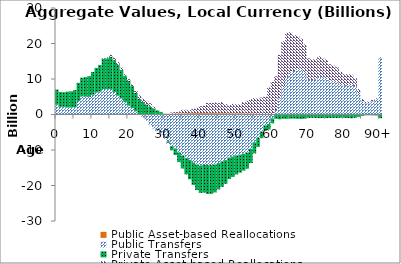
| Category | Public Asset-based Reallocations | Public Transfers | Private Transfers | Private Asset-based Reallocations |
|---|---|---|---|---|
| 0 | 8.092 | 2748.724 | 4289.608 | -169.187 |
|  | 7.989 | 2171.902 | 4144.176 | -93.478 |
| 2 | 8.125 | 2148.795 | 4119.979 | -91.648 |
| 3 | 9.049 | 1967.311 | 4468.515 | 24.611 |
| 4 | 9.156 | 1962.499 | 4567.77 | -22.379 |
| 5 | 9.583 | 2047.002 | 4802.95 | -38.806 |
| 6 | 10.312 | 3815.309 | 5081.429 | 47.349 |
| 7 | 10.588 | 5087.075 | 5277.298 | -14.346 |
| 8 | 10.856 | 5050.846 | 5466.852 | -68.893 |
| 9 | 11.866 | 4976.634 | 5820.726 | 90.197 |
| 10 | 12.942 | 5554.61 | 6396.919 | 51.38 |
| 11 | 13.899 | 6196.399 | 6925.226 | -1.856 |
| 12 | 15.134 | 6424.49 | 7494.681 | 32.801 |
| 13 | 17.517 | 7161.592 | 8512.666 | 169.958 |
| 14 | 18.224 | 7127.639 | 8674.649 | 295.455 |
| 15 | 19.937 | 7173.786 | 9091.713 | 527.118 |
| 16 | 21.127 | 6344.795 | 8949.273 | 728.414 |
| 17 | 23.627 | 5252.595 | 8681.712 | 827.658 |
| 18 | 27.805 | 4463.16 | 8061.112 | 644.635 |
| 19 | 35.643 | 3461.137 | 7456.912 | 450.371 |
| 20 | 49.069 | 2480.956 | 6930.172 | 498.028 |
| 21 | 63.831 | 1748.139 | 6183.172 | 468.806 |
| 22 | 79.064 | 822.877 | 5167.974 | 581.092 |
| 23 | 96.712 | -105.889 | 4354.209 | 994.793 |
| 24 | 107.747 | -880.101 | 3438.901 | 907.461 |
| 25 | 121.836 | -1734.32 | 2721.877 | 1004.383 |
| 26 | 135.764 | -3011.757 | 2061.304 | 975.67 |
| 27 | 147.717 | -3904.949 | 1583.716 | 457.424 |
| 28 | 157.029 | -4695.197 | 1033.76 | 82.325 |
| 29 | 171.572 | -5613.224 | 561.836 | -70.329 |
| 30 | 184.667 | -6337.218 | 57.462 | -466.424 |
| 31 | 213.345 | -7584.408 | -407.602 | -239.419 |
| 32 | 246.143 | -8925.567 | -1159.028 | 305.71 |
| 33 | 267.528 | -9560.147 | -1865.534 | 423.767 |
| 34 | 297.521 | -10685.142 | -2727.38 | 544.577 |
| 35 | 322.786 | -11579.977 | -3619.602 | 984.927 |
| 36 | 340.233 | -12290.309 | -4583.379 | 979.26 |
| 37 | 358 | -12773.454 | -5476.974 | 912.52 |
| 38 | 368.785 | -13518.613 | -6310.221 | 1270.237 |
| 39 | 382.547 | -14116.584 | -7145.55 | 1503.445 |
| 40 | 385.036 | -14378.351 | -7689.393 | 1954.385 |
| 41 | 379.813 | -14206.851 | -7785.602 | 2094.431 |
| 42 | 380.336 | -14288.512 | -8091.553 | 2849.354 |
| 43 | 377.498 | -14262.979 | -8086.824 | 2878.498 |
| 44 | 371.702 | -14096.581 | -7851.001 | 3014.958 |
| 45 | 358.885 | -13687.157 | -7411.224 | 2833.322 |
| 46 | 354.377 | -13198.746 | -7160.427 | 3179.218 |
| 47 | 345.477 | -12855.916 | -6654.645 | 2577.62 |
| 48 | 335.583 | -12109.169 | -6074.554 | 2297.509 |
| 49 | 330.208 | -11858.549 | -5727.969 | 2654.978 |
| 50 | 319.068 | -11575.769 | -5298.149 | 2562.782 |
| 51 | 319.049 | -11314.459 | -5057.215 | 2489.605 |
| 52 | 311.096 | -11075.906 | -4746.313 | 3170.88 |
| 53 | 310.003 | -10741.207 | -4509.332 | 3537.915 |
| 54 | 293.148 | -9670.703 | -4015.973 | 4015.675 |
| 55 | 262.146 | -7822.105 | -3142.86 | 4341.434 |
| 56 | 235.904 | -6630.64 | -2516.46 | 4288.368 |
| 57 | 196.515 | -4839.906 | -1828.296 | 4565.678 |
| 58 | 162.683 | -3117.64 | -1425.33 | 4855.502 |
| 59 | 199.432 | -2678.146 | -1532.765 | 7388.821 |
| 60 | 185.538 | -1095.593 | -1399.716 | 8968.303 |
| 61 | 163.381 | 1100.446 | -1208.894 | 9490.215 |
| 62 | 177.818 | 4320.266 | -1348.453 | 12284.594 |
| 63 | 170.739 | 7472.131 | -1208.551 | 12976.293 |
| 64 | 153.069 | 10446.915 | -1204.39 | 12386.603 |
| 65 | 133.203 | 11761.281 | -1175.175 | 11277.849 |
| 66 | 118.653 | 12145.803 | -1159.07 | 10102.612 |
| 67 | 111.835 | 12632.504 | -1208.078 | 9356.923 |
| 68 | 105.483 | 12672.711 | -1255.485 | 8615.289 |
| 69 | 96.312 | 11804.09 | -1179.507 | 7856.839 |
| 70 | 76.343 | 9695.459 | -948.485 | 6037.178 |
| 71 | 74.797 | 9656.547 | -942.804 | 5850.822 |
| 72 | 74.775 | 9755.581 | -961.461 | 5743.868 |
| 73 | 77.37 | 10524.577 | -1020.064 | 5789.289 |
| 74 | 73.459 | 10313.282 | -987.913 | 5361.802 |
| 75 | 71.293 | 10267.929 | -1005.562 | 5167.571 |
| 76 | 64.756 | 9463.192 | -962.251 | 4620.523 |
| 77 | 61.644 | 9390.878 | -956.442 | 4317.193 |
| 78 | 59.046 | 9057.506 | -975.633 | 4192.541 |
| 79 | 52.702 | 8331.273 | -913.847 | 3626.811 |
| 80 | 49.161 | 8080.228 | -925.219 | 3240.979 |
| 81 | 48.439 | 8231.878 | -987.154 | 3070.252 |
| 82 | 47.386 | 8278.704 | -1057.672 | 2893.278 |
| 83 | 43.109 | 7973.565 | -919.956 | 2240.033 |
| 84 | 30.01 | 5787.538 | -659.557 | 1358.402 |
| 85 | 17.568 | 3667.882 | -391.175 | 655.35 |
| 86 | 14.335 | 3151.039 | -232.605 | 481.223 |
| 87 | 13.388 | 3172.793 | -229.043 | 436.481 |
| 88 | 14.427 | 3713.941 | -261.279 | 416.749 |
| 89 | 15.531 | 4241.714 | -290.027 | 299.129 |
| 90+ | 53.107 | 15779.868 | -1051.925 | 257.323 |